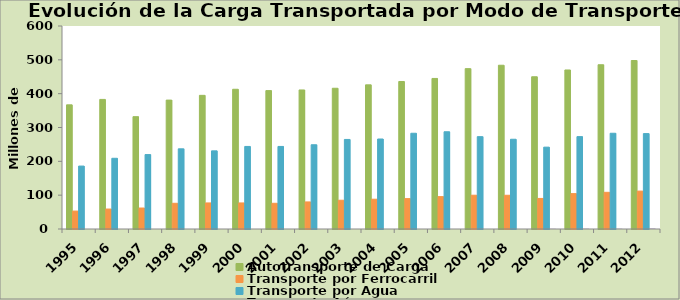
| Category | Autotransporte de Carga | Transporte por Ferrocarril | Transporte por Agua | Transporte Aéreo |
|---|---|---|---|---|
| 1995.0 | 367 | 53 | 186 | 0 |
| 1996.0 | 383 | 59 | 209 | 0 |
| 1997.0 | 332 | 62 | 220 | 0 |
| 1998.0 | 381 | 76 | 237 | 0 |
| 1999.0 | 395 | 77 | 231 | 0 |
| 2000.0 | 413 | 77 | 244 | 0 |
| 2001.0 | 409 | 76 | 244 | 0 |
| 2002.0 | 411 | 80 | 249 | 0 |
| 2003.0 | 416 | 85 | 264.7 | 0 |
| 2004.0 | 426 | 88 | 266 | 0 |
| 2005.0 | 436 | 89.814 | 283 | 0 |
| 2006.0 | 445 | 95.713 | 287.4 | 0 |
| 2007.0 | 474 | 99.845 | 272.934 | 0 |
| 2008.0 | 484 | 99.692 | 265.237 | 0 |
| 2009.0 | 450 | 90.321 | 241.923 | 0.4 |
| 2010.0 | 470 | 104.564 | 273 | 0.571 |
| 2011.0 | 485.502 | 108.433 | 283 | 0.568 |
| 2012.0 | 498 | 112 | 282 | 1 |